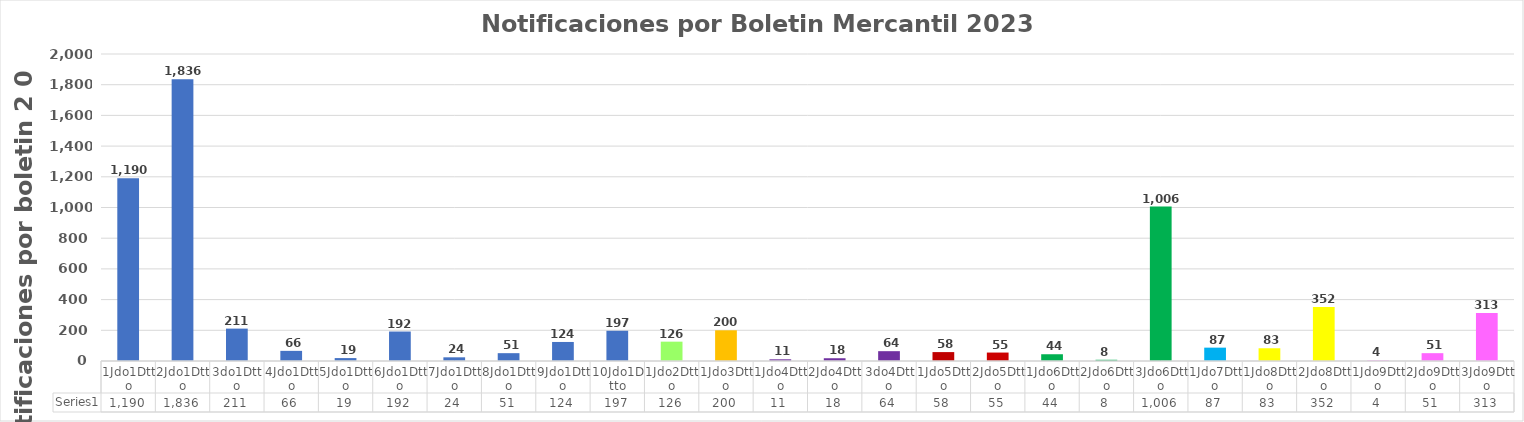
| Category | Series 0 |
|---|---|
| 1Jdo1Dtto | 1190 |
| 2Jdo1Dtto | 1836 |
| 3do1Dtto | 211 |
| 4Jdo1Dtto | 66 |
| 5Jdo1Dtto | 19 |
| 6Jdo1Dtto | 192 |
| 7Jdo1Dtto | 24 |
| 8Jdo1Dtto | 51 |
| 9Jdo1Dtto | 124 |
| 10Jdo1Dtto | 197 |
| 1Jdo2Dtto | 126 |
| 1Jdo3Dtto | 200 |
| 1Jdo4Dtto | 11 |
| 2Jdo4Dtto | 18 |
| 3do4Dtto | 64 |
| 1Jdo5Dtto | 58 |
| 2Jdo5Dtto | 55 |
| 1Jdo6Dtto | 44 |
| 2Jdo6Dtto | 8 |
| 3Jdo6Dtto | 1006 |
| 1Jdo7Dtto | 87 |
| 1Jdo8Dtto | 83 |
| 2Jdo8Dtto | 352 |
| 1Jdo9Dtto | 4 |
| 2Jdo9Dtto | 51 |
| 3Jdo9Dtto | 313 |